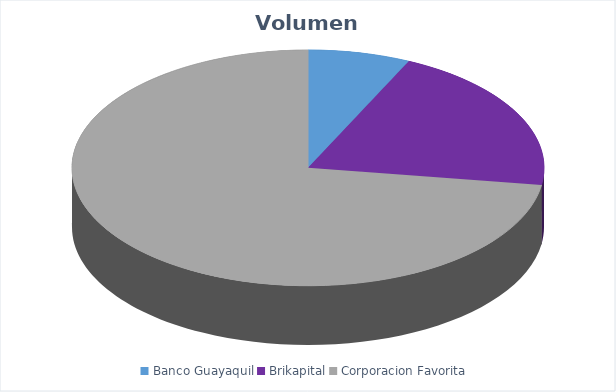
| Category | VOLUMEN ($USD) |
|---|---|
| Banco Guayaquil | 5530 |
| Brikapital | 16000 |
| Corporacion Favorita | 57286.96 |